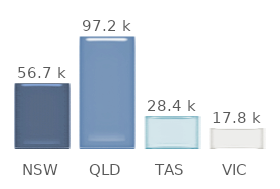
| Category | Series 0 |
|---|---|
| NSW | 56.7 |
| QLD | 97.2 |
| TAS | 28.35 |
| VIC | 17.82 |